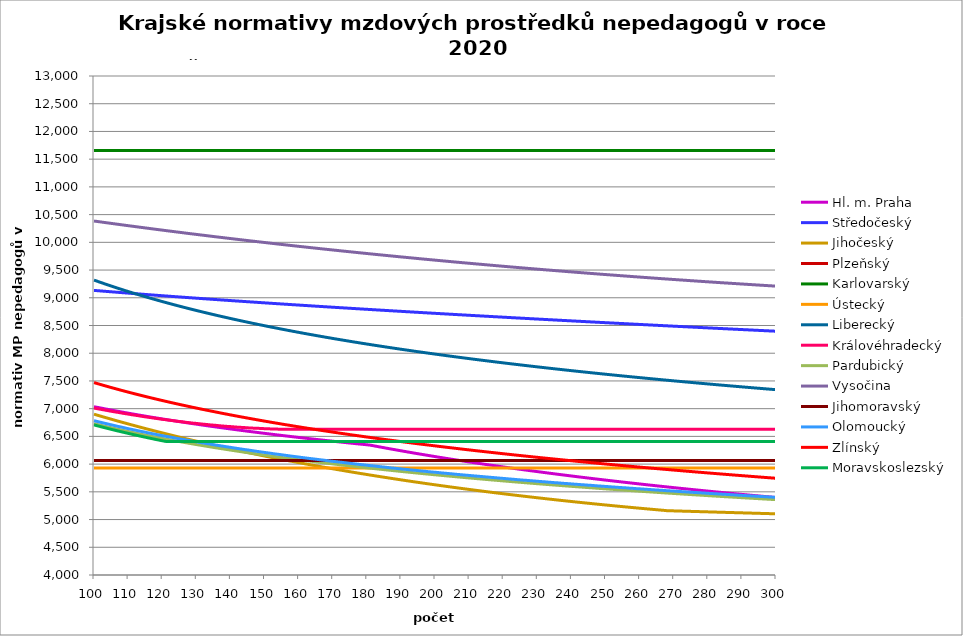
| Category | Hl. m. Praha | Středočeský | Jihočeský | Plzeňský | Karlovarský  | Ústecký   | Liberecký | Královéhradecký | Pardubický | Vysočina | Jihomoravský | Olomoucký | Zlínský | Moravskoslezský |
|---|---|---|---|---|---|---|---|---|---|---|---|---|---|---|
| 100.0 | 7035.713 | 9133.006 | 6900.258 | 3254.201 | 11657.998 | 5928.91 | 9319.242 | 7010.646 | 6730.385 | 10384.094 | 6064.946 | 6782.937 | 7470.451 | 6707.055 |
| 101.0 | 7023.452 | 9127.986 | 6882.106 | 3246.9 | 11657.998 | 5928.91 | 9297.355 | 6999.299 | 6715.356 | 10375.924 | 6064.946 | 6768.131 | 7452.298 | 6690.795 |
| 102.0 | 7011.337 | 9122.995 | 6864.1 | 3239.632 | 11657.998 | 5928.91 | 9275.775 | 6987.988 | 6700.535 | 10367.475 | 6064.946 | 6753.39 | 7434.384 | 6674.772 |
| 103.0 | 6999.366 | 9118.031 | 6846.24 | 3232.397 | 11657.998 | 5928.91 | 9254.495 | 6976.714 | 6685.916 | 10358.75 | 6064.946 | 6738.712 | 7416.705 | 6658.981 |
| 104.0 | 6987.534 | 9113.093 | 6828.523 | 3225.572 | 11657.998 | 5928.91 | 9233.508 | 6965.477 | 6671.494 | 10350.619 | 6064.946 | 6724.099 | 7399.254 | 6643.415 |
| 105.0 | 6975.839 | 9108.183 | 6810.949 | 3218.776 | 11657.998 | 5928.91 | 9212.806 | 6954.275 | 6657.266 | 10342.212 | 6064.946 | 6709.548 | 7382.027 | 6628.071 |
| 106.0 | 6964.277 | 9103.297 | 6793.516 | 3212.008 | 11657.998 | 5928.91 | 9192.382 | 6943.109 | 6643.226 | 10333.818 | 6064.946 | 6695.061 | 7365.018 | 6612.941 |
| 107.0 | 6952.847 | 9098.438 | 6776.222 | 3205.269 | 11657.998 | 5928.91 | 9172.231 | 6933.832 | 6629.371 | 10325.438 | 6064.946 | 6680.636 | 7348.221 | 6598.022 |
| 108.0 | 6941.544 | 9093.603 | 6759.066 | 3198.558 | 11657.998 | 5928.91 | 9152.345 | 6922.732 | 6615.695 | 10317.36 | 6064.946 | 6668.065 | 7331.633 | 6583.307 |
| 109.0 | 6930.367 | 9088.793 | 6742.046 | 3192.245 | 11657.998 | 5928.91 | 9132.719 | 6911.668 | 6602.194 | 10308.719 | 6064.946 | 6653.755 | 7315.248 | 6568.793 |
| 110.0 | 6919.312 | 9084.007 | 6725.162 | 3185.589 | 11657.998 | 5928.91 | 9113.346 | 6902.474 | 6588.866 | 10300.667 | 6064.946 | 6639.507 | 7299.062 | 6554.475 |
| 111.0 | 6908.377 | 9079.245 | 6708.411 | 3179.327 | 11657.998 | 5928.91 | 9094.222 | 6891.474 | 6575.705 | 10292.627 | 6064.946 | 6627.091 | 7283.071 | 6540.347 |
| 112.0 | 6897.56 | 9074.506 | 6691.793 | 3173.09 | 11657.998 | 5928.91 | 9075.339 | 6882.334 | 6562.709 | 10284.6 | 6064.946 | 6614.72 | 7267.269 | 6526.406 |
| 113.0 | 6886.858 | 9069.79 | 6675.306 | 3166.878 | 11657.998 | 5928.91 | 9056.694 | 6873.219 | 6549.873 | 10276.3 | 6064.946 | 6600.639 | 7251.654 | 6512.647 |
| 114.0 | 6876.268 | 9065.096 | 6658.948 | 3160.69 | 11657.998 | 5928.91 | 9038.28 | 6862.312 | 6537.194 | 10268.298 | 6064.946 | 6588.367 | 7236.22 | 6499.067 |
| 115.0 | 6865.789 | 9060.425 | 6642.719 | 3154.526 | 11657.998 | 5928.91 | 9020.093 | 6853.249 | 6524.668 | 10260.309 | 6064.946 | 6576.14 | 7220.965 | 6485.661 |
| 116.0 | 6855.419 | 9055.775 | 6626.617 | 3148.746 | 11657.998 | 5928.91 | 9002.128 | 6844.21 | 6512.293 | 10252.332 | 6064.946 | 6562.222 | 7205.884 | 6472.426 |
| 117.0 | 6845.155 | 9051.147 | 6610.64 | 3142.629 | 11657.998 | 5928.91 | 8984.38 | 6835.195 | 6500.065 | 10244.084 | 6064.946 | 6550.092 | 7190.973 | 6459.358 |
| 118.0 | 6834.994 | 9046.54 | 6594.788 | 3136.893 | 11657.998 | 5928.91 | 8966.844 | 6826.204 | 6487.982 | 10236.132 | 6064.946 | 6538.007 | 7176.23 | 6446.452 |
| 119.0 | 6824.936 | 9041.954 | 6579.06 | 3131.177 | 11657.998 | 5928.91 | 8949.516 | 6817.236 | 6476.039 | 10228.193 | 6064.946 | 6525.967 | 7161.65 | 6433.707 |
| 120.0 | 6814.978 | 9037.388 | 6563.453 | 3125.483 | 11657.998 | 5928.91 | 8932.392 | 6808.292 | 6464.234 | 10220.549 | 6064.946 | 6513.971 | 7147.231 | 6421.118 |
| 121.0 | 6805.118 | 9032.843 | 6547.968 | 3119.809 | 11657.998 | 5928.91 | 8915.467 | 6801.153 | 6452.565 | 10212.352 | 6064.946 | 6502.018 | 7132.969 | 6409.938 |
| 122.0 | 6795.355 | 9028.317 | 6532.602 | 3114.156 | 11657.998 | 5928.91 | 8898.737 | 6792.251 | 6441.028 | 10204.449 | 6064.946 | 6491.808 | 7118.86 | 6409.938 |
| 123.0 | 6785.686 | 9023.811 | 6517.355 | 3108.524 | 11657.998 | 5928.91 | 8882.199 | 6785.146 | 6429.622 | 10196.841 | 6064.946 | 6479.937 | 7104.902 | 6409.938 |
| 124.0 | 6776.109 | 9019.323 | 6502.225 | 3103.261 | 11657.998 | 5928.91 | 8865.848 | 6776.286 | 6418.342 | 10188.962 | 6064.946 | 6468.11 | 7091.093 | 6409.938 |
| 125.0 | 6766.624 | 9014.855 | 6487.211 | 3097.668 | 11657.998 | 5928.91 | 8849.68 | 6769.215 | 6407.188 | 10181.377 | 6064.946 | 6456.325 | 7077.428 | 6409.938 |
| 126.0 | 6757.228 | 9010.406 | 6472.312 | 3092.443 | 11657.998 | 5928.91 | 8833.693 | 6762.158 | 6396.155 | 10173.803 | 6064.946 | 6446.258 | 7063.905 | 6409.938 |
| 127.0 | 6747.92 | 9005.975 | 6457.528 | 3087.235 | 11657.998 | 5928.91 | 8817.883 | 6753.358 | 6385.243 | 10165.68 | 6064.946 | 6434.553 | 7050.522 | 6409.938 |
| 128.0 | 6738.698 | 9001.562 | 6442.856 | 3082.044 | 11657.998 | 5928.91 | 8802.245 | 6746.334 | 6374.448 | 10158.129 | 6064.946 | 6424.553 | 7037.275 | 6409.938 |
| 129.0 | 6729.56 | 8997.167 | 6428.296 | 3076.871 | 11657.998 | 5928.91 | 8786.777 | 6739.325 | 6363.769 | 10150.59 | 6064.946 | 6412.927 | 7024.163 | 6409.938 |
| 130.0 | 6720.506 | 8992.789 | 6413.847 | 3071.716 | 11657.998 | 5928.91 | 8771.476 | 6734.077 | 6353.203 | 10143.061 | 6064.946 | 6402.994 | 7011.182 | 6409.938 |
| 131.0 | 6711.533 | 8988.429 | 6399.508 | 3066.577 | 11657.998 | 5928.91 | 8756.338 | 6727.094 | 6342.748 | 10135.544 | 6064.946 | 6391.446 | 6998.33 | 6409.938 |
| 132.0 | 6702.641 | 8984.086 | 6385.277 | 3061.797 | 11657.998 | 5928.91 | 8741.36 | 6720.124 | 6332.402 | 10128.038 | 6064.946 | 6381.58 | 6985.606 | 6409.938 |
| 133.0 | 6693.827 | 8979.76 | 6371.155 | 3056.692 | 11657.998 | 5928.91 | 8726.539 | 6714.907 | 6322.163 | 10120.543 | 6064.946 | 6371.744 | 6973.005 | 6409.938 |
| 134.0 | 6685.091 | 8975.45 | 6357.138 | 3051.942 | 11657.998 | 5928.91 | 8711.873 | 6707.963 | 6312.029 | 10112.782 | 6064.946 | 6361.939 | 6960.527 | 6409.938 |
| 135.0 | 6676.431 | 8971.157 | 6343.228 | 3046.87 | 11657.998 | 5928.91 | 8697.358 | 6702.764 | 6301.998 | 10105.309 | 6064.946 | 6350.538 | 6948.169 | 6409.938 |
| 136.0 | 6667.846 | 8966.88 | 6329.422 | 3042.151 | 11657.998 | 5928.91 | 8682.991 | 6697.574 | 6292.069 | 10097.848 | 6064.946 | 6340.798 | 6935.928 | 6409.938 |
| 137.0 | 6659.335 | 8962.62 | 6315.719 | 3037.446 | 11657.998 | 5928.91 | 8668.771 | 6690.665 | 6282.238 | 10090.673 | 6064.946 | 6331.087 | 6923.804 | 6409.938 |
| 138.0 | 6650.896 | 8958.374 | 6302.12 | 3032.756 | 11657.998 | 5928.91 | 8654.694 | 6685.493 | 6272.506 | 10083.233 | 6064.946 | 6321.407 | 6911.793 | 6409.938 |
| 139.0 | 6642.528 | 8954.145 | 6288.622 | 3028.081 | 11657.998 | 5928.91 | 8640.758 | 6680.33 | 6262.869 | 10075.804 | 6064.946 | 6311.756 | 6899.894 | 6409.938 |
| 140.0 | 6634.23 | 8949.931 | 6275.226 | 3023.419 | 11657.998 | 5928.91 | 8626.96 | 6676.891 | 6253.327 | 10068.661 | 6064.946 | 6302.134 | 6888.104 | 6409.938 |
| 141.0 | 6626.001 | 8945.731 | 6261.929 | 3018.773 | 11657.998 | 5928.91 | 8613.298 | 6671.741 | 6243.877 | 10061.253 | 6064.946 | 6292.542 | 6876.423 | 6409.938 |
| 142.0 | 6617.84 | 8941.547 | 6248.731 | 3014.471 | 11657.998 | 5928.91 | 8599.77 | 6666.598 | 6234.518 | 10054.131 | 6064.946 | 6282.979 | 6864.847 | 6409.938 |
| 143.0 | 6609.745 | 8937.378 | 6235.631 | 3009.851 | 11657.998 | 5928.91 | 8586.373 | 6663.174 | 6225.248 | 10047.018 | 6064.946 | 6273.445 | 6853.376 | 6409.938 |
| 144.0 | 6601.716 | 8933.223 | 6222.629 | 3005.574 | 11657.998 | 5928.91 | 8573.104 | 6659.754 | 6216.067 | 10039.642 | 6064.946 | 6263.939 | 6842.007 | 6409.938 |
| 145.0 | 6593.752 | 8929.083 | 6209.723 | 3000.982 | 11657.998 | 5928.91 | 8559.962 | 6654.629 | 6206.971 | 10032.55 | 6064.946 | 6256.04 | 6830.739 | 6409.938 |
| 146.0 | 6585.851 | 8924.957 | 6196.913 | 2996.731 | 11657.998 | 5928.91 | 8546.945 | 6651.218 | 6197.961 | 10025.468 | 6064.946 | 6246.588 | 6819.57 | 6409.938 |
| 147.0 | 6578.013 | 8920.844 | 6184.197 | 2992.491 | 11657.998 | 5928.91 | 8534.05 | 6647.809 | 6189.034 | 10018.395 | 6064.946 | 6237.164 | 6808.499 | 6409.938 |
| 148.0 | 6570.236 | 8916.746 | 6171.575 | 2987.939 | 11657.998 | 5928.91 | 8521.276 | 6646.107 | 6180.19 | 10011.333 | 6064.946 | 6227.768 | 6797.523 | 6409.938 |
| 149.0 | 6562.52 | 8912.662 | 6159.047 | 2983.724 | 11657.998 | 5928.91 | 8508.62 | 6642.704 | 6171.426 | 10004.281 | 6064.946 | 6219.96 | 6786.642 | 6409.938 |
| 150.0 | 6554.864 | 8908.591 | 6146.61 | 2979.521 | 11657.998 | 5928.91 | 8496.081 | 6639.304 | 6162.741 | 9997.238 | 6064.946 | 6210.616 | 6775.853 | 6409.938 |
| 151.0 | 6547.267 | 8904.533 | 6134.265 | 2975.33 | 11657.998 | 5928.91 | 8483.656 | 6637.606 | 6154.135 | 9990.206 | 6064.946 | 6202.851 | 6765.156 | 6409.938 |
| 152.0 | 6539.727 | 8900.488 | 6122.01 | 2971.472 | 11657.998 | 5928.91 | 8471.343 | 6634.211 | 6145.606 | 9983.183 | 6064.946 | 6193.558 | 6754.549 | 6409.938 |
| 153.0 | 6532.245 | 8896.457 | 6109.845 | 2967.303 | 11657.998 | 5928.91 | 8459.142 | 6632.515 | 6137.152 | 9976.171 | 6064.946 | 6184.293 | 6744.03 | 6409.938 |
| 154.0 | 6524.818 | 8892.438 | 6097.769 | 2963.147 | 11657.998 | 5928.91 | 8447.05 | 6630.82 | 6128.773 | 9969.168 | 6064.946 | 6176.594 | 6733.598 | 6409.938 |
| 155.0 | 6517.448 | 8888.433 | 6085.782 | 2959.32 | 11657.998 | 5928.91 | 8435.064 | 6629.126 | 6120.468 | 9962.443 | 6064.946 | 6168.913 | 6723.251 | 6409.938 |
| 156.0 | 6510.131 | 8884.44 | 6073.882 | 2955.185 | 11657.998 | 5928.91 | 8423.185 | 6629.126 | 6112.234 | 9955.46 | 6064.946 | 6159.722 | 6712.99 | 6409.938 |
| 157.0 | 6502.869 | 8880.459 | 6062.069 | 2951.379 | 11657.998 | 5928.91 | 8411.41 | 6629.126 | 6104.071 | 9948.486 | 6064.946 | 6152.083 | 6702.811 | 6409.938 |
| 158.0 | 6495.659 | 8876.491 | 6050.341 | 2947.267 | 11657.998 | 5928.91 | 8399.737 | 6629.126 | 6095.979 | 9941.789 | 6064.946 | 6142.942 | 6692.714 | 6409.938 |
| 159.0 | 6488.502 | 8872.534 | 6038.699 | 2943.481 | 11657.998 | 5928.91 | 8388.164 | 6629.126 | 6087.955 | 9935.102 | 6064.946 | 6135.345 | 6682.697 | 6409.938 |
| 160.0 | 6481.396 | 8868.59 | 6027.142 | 2939.705 | 11657.998 | 5928.91 | 8376.691 | 6629.126 | 6079.999 | 9928.157 | 6064.946 | 6127.767 | 6672.76 | 6409.938 |
| 161.0 | 6474.341 | 8864.658 | 6015.668 | 2935.939 | 11657.998 | 5928.91 | 8365.316 | 6629.126 | 6072.11 | 9921.487 | 6064.946 | 6118.698 | 6662.901 | 6409.938 |
| 162.0 | 6467.336 | 8860.738 | 6004.278 | 2932.182 | 11657.998 | 5928.91 | 8354.036 | 6629.126 | 6064.286 | 9915.094 | 6064.946 | 6111.16 | 6653.119 | 6409.938 |
| 163.0 | 6460.381 | 8856.829 | 5992.97 | 2928.123 | 11657.998 | 5928.91 | 8342.852 | 6629.126 | 6056.528 | 9908.176 | 6064.946 | 6103.642 | 6643.413 | 6409.938 |
| 164.0 | 6453.474 | 8852.932 | 5981.744 | 2924.697 | 11657.998 | 5928.91 | 8331.761 | 6629.126 | 6048.833 | 9901.534 | 6064.946 | 6096.142 | 6633.781 | 6409.938 |
| 165.0 | 6446.615 | 8849.046 | 5970.599 | 2920.969 | 11657.998 | 5928.91 | 8320.761 | 6629.126 | 6041.201 | 9894.9 | 6064.946 | 6088.66 | 6624.224 | 6409.938 |
| 166.0 | 6439.803 | 8845.171 | 5959.534 | 2917.25 | 11657.998 | 5928.91 | 8309.852 | 6629.126 | 6033.631 | 9888.276 | 6064.946 | 6081.196 | 6614.738 | 6409.938 |
| 167.0 | 6433.038 | 8841.308 | 5948.549 | 2913.541 | 11657.998 | 5928.91 | 8299.033 | 6629.126 | 6026.122 | 9881.66 | 6064.946 | 6073.751 | 6605.325 | 6409.938 |
| 168.0 | 6426.319 | 8837.456 | 5937.643 | 2909.841 | 11657.998 | 5928.91 | 8288.301 | 6629.126 | 6018.673 | 9875.053 | 6064.946 | 6066.324 | 6595.982 | 6409.938 |
| 169.0 | 6419.645 | 8833.614 | 5926.815 | 2906.458 | 11657.998 | 5928.91 | 8277.656 | 6629.126 | 6011.283 | 9868.456 | 6064.946 | 6057.436 | 6586.708 | 6409.938 |
| 170.0 | 6413.017 | 8829.784 | 5916.066 | 2902.776 | 11657.998 | 5928.91 | 8267.097 | 6629.126 | 6003.952 | 9862.13 | 6064.946 | 6050.049 | 6577.503 | 6409.938 |
| 171.0 | 6406.432 | 8825.964 | 5905.393 | 2899.41 | 11657.998 | 5928.91 | 8256.621 | 6629.126 | 5996.679 | 9855.812 | 6064.946 | 6044.152 | 6568.365 | 6409.938 |
| 172.0 | 6399.891 | 8822.155 | 5894.797 | 2895.746 | 11657.998 | 5928.91 | 8246.229 | 6629.126 | 5989.462 | 9849.24 | 6064.946 | 6036.797 | 6559.294 | 6409.938 |
| 173.0 | 6393.393 | 8818.356 | 5884.277 | 2892.395 | 11657.998 | 5928.91 | 8235.918 | 6629.126 | 5982.302 | 9842.676 | 6064.946 | 6029.46 | 6550.289 | 6409.938 |
| 174.0 | 6386.938 | 8814.567 | 5873.833 | 2889.052 | 11657.998 | 5928.91 | 8225.688 | 6629.126 | 5975.196 | 9836.383 | 6064.946 | 6022.141 | 6541.348 | 6409.938 |
| 175.0 | 6380.525 | 8810.789 | 5863.463 | 2885.414 | 11657.998 | 5928.91 | 8215.537 | 6629.126 | 5968.145 | 9830.099 | 6064.946 | 6014.84 | 6532.472 | 6409.938 |
| 176.0 | 6374.153 | 8807.021 | 5853.167 | 2882.088 | 11657.998 | 5928.91 | 8205.465 | 6629.126 | 5961.148 | 9823.822 | 6064.946 | 6007.556 | 6523.658 | 6409.938 |
| 177.0 | 6367.822 | 8803.264 | 5842.944 | 2878.769 | 11657.998 | 5928.91 | 8195.47 | 6629.126 | 5954.203 | 9817.292 | 6064.946 | 6000.29 | 6514.907 | 6409.938 |
| 178.0 | 6361.531 | 8799.516 | 5832.795 | 2875.457 | 11657.998 | 5928.91 | 8185.552 | 6629.126 | 5947.311 | 9811.032 | 6064.946 | 5993.042 | 6506.217 | 6409.938 |
| 179.0 | 6355.28 | 8795.778 | 5822.718 | 2872.154 | 11657.998 | 5928.91 | 8175.708 | 6629.126 | 5940.471 | 9804.78 | 6064.946 | 5987.256 | 6497.588 | 6409.938 |
| 180.0 | 6349.068 | 8792.049 | 5812.713 | 2868.858 | 11657.998 | 5928.91 | 8165.939 | 6629.126 | 5933.681 | 9798.535 | 6064.946 | 5980.039 | 6489.018 | 6409.938 |
| 181.0 | 6342.353 | 8788.331 | 5802.779 | 2865.569 | 11657.998 | 5928.91 | 8156.242 | 6629.126 | 5926.941 | 9792.299 | 6064.946 | 5972.839 | 6480.507 | 6409.938 |
| 182.0 | 6330.674 | 8784.622 | 5792.916 | 2862.288 | 11657.998 | 5928.91 | 8146.618 | 6629.126 | 5920.251 | 9786.07 | 6064.946 | 5967.092 | 6472.054 | 6409.938 |
| 183.0 | 6319.095 | 8780.923 | 5783.123 | 2859.312 | 11657.998 | 5928.91 | 8137.065 | 6629.126 | 5913.61 | 9779.85 | 6064.946 | 5959.923 | 6463.659 | 6409.938 |
| 184.0 | 6307.613 | 8777.232 | 5773.399 | 2856.045 | 11657.998 | 5928.91 | 8127.583 | 6629.126 | 5907.016 | 9773.896 | 6064.946 | 5952.772 | 6455.32 | 6409.938 |
| 185.0 | 6296.228 | 8773.552 | 5763.745 | 2852.786 | 11657.998 | 5928.91 | 8118.169 | 6629.126 | 5900.471 | 9767.69 | 6064.946 | 5947.063 | 6447.038 | 6409.938 |
| 186.0 | 6284.937 | 8769.88 | 5754.159 | 2849.829 | 11657.998 | 5928.91 | 8108.824 | 6629.126 | 5893.972 | 9761.493 | 6064.946 | 5939.943 | 6438.81 | 6409.938 |
| 187.0 | 6273.74 | 8766.218 | 5744.641 | 2846.584 | 11657.998 | 5928.91 | 8099.547 | 6629.126 | 5887.519 | 9755.561 | 6064.946 | 5932.839 | 6430.637 | 6409.938 |
| 188.0 | 6262.635 | 8762.565 | 5735.191 | 2843.346 | 11657.998 | 5928.91 | 8090.336 | 6629.126 | 5881.113 | 9749.637 | 6064.946 | 5927.168 | 6422.518 | 6409.938 |
| 189.0 | 6251.621 | 8758.921 | 5725.808 | 2840.409 | 11657.998 | 5928.91 | 8081.191 | 6629.126 | 5874.751 | 9743.463 | 6064.946 | 5920.095 | 6414.452 | 6409.938 |
| 190.0 | 6240.696 | 8755.285 | 5716.491 | 2837.478 | 11657.998 | 5928.91 | 8072.111 | 6629.126 | 5868.434 | 9737.296 | 6064.946 | 5914.449 | 6406.438 | 6409.938 |
| 191.0 | 6229.86 | 8751.659 | 5707.24 | 2834.261 | 11657.998 | 5928.91 | 8063.095 | 6629.126 | 5862.161 | 9731.65 | 6064.946 | 5907.407 | 6398.476 | 6409.938 |
| 192.0 | 6219.11 | 8748.041 | 5698.055 | 2831.343 | 11657.998 | 5928.91 | 8054.142 | 6629.126 | 5855.931 | 9725.498 | 6064.946 | 5901.784 | 6390.566 | 6409.938 |
| 193.0 | 6208.446 | 8744.432 | 5688.935 | 2828.43 | 11657.998 | 5928.91 | 8045.252 | 6629.126 | 5849.744 | 9719.866 | 6064.946 | 5894.772 | 6382.706 | 6409.938 |
| 194.0 | 6197.867 | 8740.832 | 5679.879 | 2825.234 | 11657.998 | 5928.91 | 8036.423 | 6629.126 | 5843.6 | 9713.73 | 6064.946 | 5889.174 | 6374.895 | 6409.938 |
| 195.0 | 6187.371 | 8737.24 | 5670.887 | 2822.334 | 11657.998 | 5928.91 | 8027.656 | 6629.126 | 5837.497 | 9707.856 | 6064.946 | 5883.586 | 6367.135 | 6409.938 |
| 196.0 | 6176.957 | 8733.656 | 5661.959 | 2819.44 | 11657.998 | 5928.91 | 8018.948 | 6629.126 | 5831.436 | 9701.734 | 6064.946 | 5876.617 | 6359.422 | 6409.938 |
| 197.0 | 6166.624 | 8730.081 | 5653.094 | 2816.552 | 11657.998 | 5928.91 | 8010.3 | 6629.126 | 5825.416 | 9696.129 | 6064.946 | 5871.053 | 6351.758 | 6409.938 |
| 198.0 | 6156.372 | 8726.514 | 5644.292 | 2813.67 | 11657.998 | 5928.91 | 8001.711 | 6629.126 | 5819.435 | 9690.277 | 6064.946 | 5864.113 | 6344.142 | 6409.938 |
| 199.0 | 6146.198 | 8722.956 | 5635.552 | 2810.794 | 11657.998 | 5928.91 | 7993.179 | 6629.126 | 5813.495 | 9684.685 | 6064.946 | 5858.573 | 6336.572 | 6409.938 |
| 200.0 | 6136.102 | 8719.405 | 5626.873 | 2807.924 | 11657.998 | 5928.91 | 7984.705 | 6629.126 | 5807.594 | 9678.847 | 6064.946 | 5853.044 | 6329.049 | 6409.938 |
| 201.0 | 6126.084 | 8715.863 | 5618.256 | 2805.06 | 11657.998 | 5928.91 | 7976.287 | 6629.126 | 5801.732 | 9673.015 | 6064.946 | 5847.525 | 6321.572 | 6409.938 |
| 202.0 | 6116.14 | 8712.329 | 5609.7 | 2802.201 | 11657.998 | 5928.91 | 7967.925 | 6629.126 | 5795.908 | 9667.443 | 6064.946 | 5840.64 | 6314.14 | 6409.938 |
| 203.0 | 6106.272 | 8708.802 | 5601.204 | 2799.348 | 11657.998 | 5928.91 | 7959.619 | 6629.126 | 5790.122 | 9661.625 | 6064.946 | 5835.145 | 6306.753 | 6409.938 |
| 204.0 | 6096.478 | 8705.284 | 5592.769 | 2796.786 | 11657.998 | 5928.91 | 7951.366 | 6629.126 | 5784.373 | 9656.067 | 6064.946 | 5829.659 | 6299.41 | 6409.938 |
| 205.0 | 6086.756 | 8701.773 | 5584.392 | 2793.944 | 11657.998 | 5928.91 | 7943.168 | 6629.126 | 5778.662 | 9650.263 | 6064.946 | 5824.184 | 6292.11 | 6409.938 |
| 206.0 | 6077.106 | 8698.27 | 5576.075 | 2791.108 | 11657.998 | 5928.91 | 7935.023 | 6629.126 | 5772.987 | 9644.465 | 6064.946 | 5817.355 | 6284.855 | 6409.938 |
| 207.0 | 6067.527 | 8694.775 | 5567.817 | 2788.561 | 11657.998 | 5928.91 | 7926.931 | 6629.126 | 5767.348 | 9639.178 | 6064.946 | 5811.903 | 6277.641 | 6409.938 |
| 208.0 | 6058.019 | 8691.288 | 5559.617 | 2785.736 | 11657.998 | 5928.91 | 7918.89 | 6629.126 | 5761.745 | 9633.394 | 6064.946 | 5806.461 | 6270.471 | 6409.938 |
| 209.0 | 6048.579 | 8687.808 | 5551.475 | 2783.198 | 11657.998 | 5928.91 | 7910.902 | 6629.126 | 5756.178 | 9628.119 | 6064.946 | 5801.029 | 6263.342 | 6409.938 |
| 210.0 | 6039.208 | 8684.335 | 5543.39 | 2780.384 | 11657.998 | 5928.91 | 7902.963 | 6629.126 | 5750.645 | 9622.348 | 6064.946 | 5795.607 | 6256.254 | 6409.938 |
| 211.0 | 6029.904 | 8680.87 | 5535.363 | 2777.856 | 11657.998 | 5928.91 | 7895.075 | 6629.126 | 5745.147 | 9617.086 | 6064.946 | 5790.196 | 6249.207 | 6409.938 |
| 212.0 | 6020.667 | 8677.413 | 5527.392 | 2775.053 | 11657.998 | 5928.91 | 7887.237 | 6629.126 | 5739.683 | 9611.328 | 6064.946 | 5784.795 | 6242.2 | 6409.938 |
| 213.0 | 6011.495 | 8673.962 | 5519.478 | 2772.535 | 11657.998 | 5928.91 | 7879.448 | 6629.126 | 5734.253 | 9606.077 | 6064.946 | 5779.404 | 6235.234 | 6409.938 |
| 214.0 | 6002.388 | 8670.519 | 5511.619 | 2769.742 | 11657.998 | 5928.91 | 7871.707 | 6629.126 | 5728.856 | 9600.582 | 6064.946 | 5774.022 | 6228.307 | 6409.938 |
| 215.0 | 5993.346 | 8667.084 | 5503.817 | 2767.234 | 11657.998 | 5928.91 | 7864.014 | 6629.126 | 5723.492 | 9595.094 | 6064.946 | 5768.651 | 6221.419 | 6409.938 |
| 216.0 | 5984.366 | 8663.655 | 5496.069 | 2764.73 | 11657.998 | 5928.91 | 7856.369 | 6629.126 | 5718.161 | 9589.612 | 6064.946 | 5763.29 | 6214.57 | 6409.938 |
| 217.0 | 5975.45 | 8660.234 | 5488.376 | 2762.23 | 11657.998 | 5928.91 | 7848.771 | 6629.126 | 5712.862 | 9584.385 | 6064.946 | 5757.939 | 6207.759 | 6409.938 |
| 218.0 | 5966.595 | 8656.819 | 5480.738 | 2759.458 | 11657.998 | 5928.91 | 7841.219 | 6629.126 | 5707.595 | 9578.915 | 6064.946 | 5752.597 | 6200.985 | 6409.938 |
| 219.0 | 5957.801 | 8653.412 | 5473.153 | 2756.968 | 11657.998 | 5928.91 | 7833.712 | 6629.126 | 5702.36 | 9573.699 | 6064.946 | 5747.266 | 6194.25 | 6409.938 |
| 220.0 | 5949.067 | 8650.011 | 5465.623 | 2754.483 | 11657.998 | 5928.91 | 7826.251 | 6629.126 | 5697.156 | 9568.241 | 6064.946 | 5741.944 | 6187.551 | 6409.938 |
| 221.0 | 5940.393 | 8646.618 | 5458.146 | 2752.002 | 11657.998 | 5928.91 | 7818.835 | 6629.126 | 5691.982 | 9563.037 | 6064.946 | 5736.633 | 6180.889 | 6409.938 |
| 222.0 | 5931.777 | 8643.231 | 5450.721 | 2749.525 | 11657.998 | 5928.91 | 7811.464 | 6629.126 | 5686.839 | 9557.592 | 6064.946 | 5731.331 | 6174.263 | 6409.938 |
| 223.0 | 5923.22 | 8639.851 | 5443.35 | 2747.053 | 11657.998 | 5928.91 | 7804.136 | 6629.126 | 5681.727 | 9552.647 | 6064.946 | 5726.039 | 6167.673 | 6409.938 |
| 224.0 | 5914.72 | 8636.478 | 5436.031 | 2744.585 | 11657.998 | 5928.91 | 7796.852 | 6629.126 | 5676.644 | 9547.46 | 6064.946 | 5720.756 | 6161.118 | 6409.938 |
| 225.0 | 5906.277 | 8633.112 | 5428.763 | 2742.122 | 11657.998 | 5928.91 | 7789.61 | 6629.126 | 5671.591 | 9542.032 | 6064.946 | 5715.484 | 6154.598 | 6409.938 |
| 226.0 | 5897.89 | 8629.752 | 5421.548 | 2739.663 | 11657.998 | 5928.91 | 7782.411 | 6629.126 | 5666.567 | 9537.103 | 6064.946 | 5710.221 | 6148.113 | 6409.938 |
| 227.0 | 5889.559 | 8626.399 | 5414.383 | 2737.209 | 11657.998 | 5928.91 | 7775.254 | 6629.126 | 5661.572 | 9531.686 | 6064.946 | 5706.28 | 6141.663 | 6409.938 |
| 228.0 | 5881.282 | 8623.052 | 5407.27 | 2735.031 | 11657.998 | 5928.91 | 7768.139 | 6629.126 | 5656.606 | 9526.768 | 6064.946 | 5701.034 | 6135.246 | 6409.938 |
| 229.0 | 5873.059 | 8619.712 | 5400.207 | 2732.585 | 11657.998 | 5928.91 | 7761.065 | 6629.126 | 5651.668 | 9521.609 | 6064.946 | 5695.798 | 6128.864 | 6409.938 |
| 230.0 | 5864.89 | 8616.379 | 5393.195 | 2730.143 | 11657.998 | 5928.91 | 7754.031 | 6629.126 | 5646.758 | 9516.456 | 6064.946 | 5690.571 | 6122.514 | 6409.938 |
| 231.0 | 5856.774 | 8613.052 | 5386.233 | 2727.706 | 11657.998 | 5928.91 | 7747.038 | 6629.126 | 5641.876 | 9511.553 | 6064.946 | 5685.354 | 6116.198 | 6409.938 |
| 232.0 | 5848.71 | 8609.731 | 5379.32 | 2725.543 | 11657.998 | 5928.91 | 7740.084 | 6629.126 | 5637.021 | 9506.166 | 6064.946 | 5681.448 | 6109.914 | 6409.938 |
| 233.0 | 5840.698 | 8606.416 | 5372.457 | 2723.113 | 11657.998 | 5928.91 | 7733.17 | 6629.126 | 5632.193 | 9501.274 | 6064.946 | 5676.247 | 6103.662 | 6409.938 |
| 234.0 | 5832.737 | 8603.108 | 5365.643 | 2720.689 | 11657.998 | 5928.91 | 7726.296 | 6629.126 | 5627.393 | 9496.387 | 6064.946 | 5671.056 | 6097.442 | 6409.938 |
| 235.0 | 5824.827 | 8599.806 | 5358.877 | 2718.537 | 11657.998 | 5928.91 | 7719.459 | 6629.126 | 5622.619 | 9491.261 | 6064.946 | 5665.875 | 6091.255 | 6409.938 |
| 236.0 | 5816.966 | 8596.51 | 5352.16 | 2716.12 | 11657.998 | 5928.91 | 7712.661 | 6629.126 | 5617.871 | 9486.384 | 6064.946 | 5661.995 | 6085.098 | 6409.938 |
| 237.0 | 5809.155 | 8593.221 | 5345.492 | 2713.976 | 11657.998 | 5928.91 | 7705.901 | 6629.126 | 5613.149 | 9481.512 | 6064.946 | 5656.83 | 6078.972 | 6409.938 |
| 238.0 | 5801.393 | 8589.937 | 5338.871 | 2711.567 | 11657.998 | 5928.91 | 7699.178 | 6629.126 | 5608.453 | 9476.402 | 6064.946 | 5651.675 | 6072.878 | 6409.938 |
| 239.0 | 5793.679 | 8586.66 | 5332.297 | 2709.43 | 11657.998 | 5928.91 | 7692.492 | 6629.126 | 5603.783 | 9471.54 | 6064.946 | 5647.814 | 6066.813 | 6409.938 |
| 240.0 | 5786.013 | 8583.388 | 5325.771 | 2707.029 | 11657.998 | 5928.91 | 7685.843 | 6629.126 | 5599.138 | 9466.926 | 6064.946 | 5642.675 | 6060.779 | 6409.938 |
| 241.0 | 5778.394 | 8580.123 | 5319.292 | 2704.899 | 11657.998 | 5928.91 | 7679.23 | 6629.126 | 5594.518 | 9461.832 | 6064.946 | 5637.545 | 6054.775 | 6409.938 |
| 242.0 | 5770.822 | 8576.864 | 5312.859 | 2702.772 | 11657.998 | 5928.91 | 7672.654 | 6629.126 | 5589.923 | 9456.986 | 6064.946 | 5633.704 | 6048.8 | 6409.938 |
| 243.0 | 5763.296 | 8573.61 | 5306.473 | 2700.383 | 11657.998 | 5928.91 | 7666.112 | 6629.126 | 5585.353 | 9452.386 | 6064.946 | 5628.591 | 6042.854 | 6409.938 |
| 244.0 | 5755.816 | 8570.362 | 5300.134 | 2698.263 | 11657.998 | 5928.91 | 7659.607 | 6629.126 | 5580.807 | 9447.549 | 6064.946 | 5624.762 | 6036.938 | 6409.938 |
| 245.0 | 5748.381 | 8567.121 | 5293.84 | 2696.147 | 11657.998 | 5928.91 | 7653.136 | 6629.126 | 5576.284 | 9442.717 | 6064.946 | 5619.665 | 6031.05 | 6409.938 |
| 246.0 | 5740.991 | 8563.885 | 5287.591 | 2694.034 | 11657.998 | 5928.91 | 7646.699 | 6629.126 | 5571.786 | 9437.89 | 6064.946 | 5615.848 | 6025.19 | 6409.938 |
| 247.0 | 5733.645 | 8560.654 | 5281.388 | 2691.66 | 11657.998 | 5928.91 | 7640.297 | 6629.126 | 5567.311 | 9433.309 | 6064.946 | 5610.767 | 6019.359 | 6409.938 |
| 248.0 | 5726.343 | 8557.43 | 5275.23 | 2689.554 | 11657.998 | 5928.91 | 7633.929 | 6629.126 | 5562.86 | 9428.25 | 6064.946 | 5605.695 | 6013.556 | 6409.938 |
| 249.0 | 5719.085 | 8554.211 | 5269.117 | 2687.451 | 11657.998 | 5928.91 | 7627.594 | 6629.126 | 5558.432 | 9423.679 | 6064.946 | 5601.897 | 6007.78 | 6409.938 |
| 250.0 | 5711.869 | 8550.998 | 5263.048 | 2685.352 | 11657.998 | 5928.91 | 7621.292 | 6629.126 | 5554.027 | 9419.111 | 6064.946 | 5596.841 | 6002.032 | 6409.938 |
| 251.0 | 5704.696 | 8547.79 | 5257.024 | 2683.255 | 11657.998 | 5928.91 | 7615.024 | 6629.126 | 5549.644 | 9414.548 | 6064.946 | 5593.055 | 5996.31 | 6409.938 |
| 252.0 | 5697.564 | 8544.588 | 5251.043 | 2681.162 | 11657.998 | 5928.91 | 7608.788 | 6629.126 | 5545.284 | 9409.99 | 6064.946 | 5588.015 | 5990.616 | 6409.938 |
| 253.0 | 5690.475 | 8541.392 | 5245.107 | 2679.072 | 11657.998 | 5928.91 | 7602.584 | 6629.126 | 5540.947 | 9405.196 | 6064.946 | 5584.241 | 5984.948 | 6409.938 |
| 254.0 | 5683.426 | 8538.201 | 5239.214 | 2676.986 | 11657.998 | 5928.91 | 7596.412 | 6629.126 | 5536.631 | 9400.647 | 6064.946 | 5579.217 | 5979.307 | 6409.938 |
| 255.0 | 5676.418 | 8535.015 | 5233.364 | 2674.903 | 11657.998 | 5928.91 | 7590.272 | 6629.126 | 5532.337 | 9396.102 | 6064.946 | 5575.455 | 5973.692 | 6409.938 |
| 256.0 | 5669.451 | 8531.835 | 5227.557 | 2672.823 | 11657.998 | 5928.91 | 7584.164 | 6629.126 | 5528.065 | 9391.561 | 6064.946 | 5571.698 | 5968.103 | 6409.938 |
| 257.0 | 5662.523 | 8528.661 | 5221.793 | 2670.746 | 11657.998 | 5928.91 | 7578.086 | 6629.126 | 5523.815 | 9387.025 | 6064.946 | 5566.697 | 5962.539 | 6409.938 |
| 258.0 | 5655.635 | 8525.492 | 5216.071 | 2668.672 | 11657.998 | 5928.91 | 7572.04 | 6629.126 | 5519.586 | 9382.254 | 6064.946 | 5562.951 | 5957.001 | 6409.938 |
| 259.0 | 5648.786 | 8522.328 | 5210.392 | 2666.602 | 11657.998 | 5928.91 | 7566.023 | 6629.126 | 5515.377 | 9377.965 | 6064.946 | 5557.965 | 5951.488 | 6409.938 |
| 260.0 | 5641.975 | 8519.169 | 5204.755 | 2664.535 | 11657.998 | 5928.91 | 7560.037 | 6629.126 | 5511.19 | 9373.442 | 6064.946 | 5554.232 | 5946 | 6409.938 |
| 261.0 | 5635.203 | 8516.016 | 5199.16 | 2662.471 | 11657.998 | 5928.91 | 7554.081 | 6629.126 | 5507.023 | 9368.923 | 6064.946 | 5550.503 | 5940.536 | 6409.938 |
| 262.0 | 5628.469 | 8512.868 | 5193.606 | 2660.668 | 11657.998 | 5928.91 | 7548.155 | 6629.126 | 5502.877 | 9364.646 | 6064.946 | 5545.54 | 5935.098 | 6409.938 |
| 263.0 | 5621.772 | 8509.725 | 5188.094 | 2658.61 | 11657.998 | 5928.91 | 7542.258 | 6629.126 | 5498.751 | 9360.136 | 6064.946 | 5541.823 | 5929.683 | 6409.938 |
| 264.0 | 5615.113 | 8506.587 | 5182.622 | 2656.555 | 11657.998 | 5928.91 | 7536.39 | 6629.126 | 5494.645 | 9355.63 | 6064.946 | 5536.875 | 5924.293 | 6409.938 |
| 265.0 | 5608.49 | 8503.455 | 5177.192 | 2654.76 | 11657.998 | 5928.91 | 7530.551 | 6629.126 | 5490.56 | 9351.365 | 6064.946 | 5533.17 | 5918.926 | 6409.938 |
| 266.0 | 5601.903 | 8500.328 | 5171.802 | 2652.711 | 11657.998 | 5928.91 | 7524.741 | 6629.126 | 5486.494 | 9346.867 | 6064.946 | 5529.469 | 5913.584 | 6409.938 |
| 267.0 | 5595.353 | 8497.205 | 5166.453 | 2650.665 | 11657.998 | 5928.91 | 7518.959 | 6629.126 | 5482.447 | 9342.611 | 6064.946 | 5525.774 | 5908.264 | 6409.938 |
| 268.0 | 5588.839 | 8494.088 | 5160.173 | 2648.878 | 11657.998 | 5928.91 | 7513.205 | 6629.126 | 5478.42 | 9338.358 | 6064.946 | 5520.855 | 5902.968 | 6409.938 |
| 269.0 | 5582.359 | 8490.976 | 5158.369 | 2646.838 | 11657.998 | 5928.91 | 7507.479 | 6629.126 | 5474.412 | 9334.109 | 6064.946 | 5517.171 | 5897.695 | 6409.938 |
| 270.0 | 5575.915 | 8487.869 | 5156.568 | 2644.801 | 11657.998 | 5928.91 | 7501.78 | 6629.126 | 5470.423 | 9329.863 | 6064.946 | 5513.492 | 5892.445 | 6409.938 |
| 271.0 | 5569.506 | 8484.767 | 5154.768 | 2643.022 | 11657.998 | 5928.91 | 7496.109 | 6629.126 | 5466.454 | 9325.622 | 6064.946 | 5508.594 | 5887.218 | 6409.938 |
| 272.0 | 5563.131 | 8481.669 | 5152.971 | 2640.991 | 11657.998 | 5928.91 | 7490.465 | 6629.126 | 5462.503 | 9321.384 | 6064.946 | 5504.927 | 5882.013 | 6409.938 |
| 273.0 | 5556.79 | 8478.577 | 5151.176 | 2639.217 | 11657.998 | 5928.91 | 7484.848 | 6629.126 | 5458.57 | 9317.151 | 6064.946 | 5501.264 | 5876.83 | 6409.938 |
| 274.0 | 5550.482 | 8475.49 | 5149.383 | 2637.192 | 11657.998 | 5928.91 | 7479.257 | 6629.126 | 5454.656 | 9312.921 | 6064.946 | 5497.606 | 5871.67 | 6409.938 |
| 275.0 | 5544.208 | 8472.407 | 5147.592 | 2635.423 | 11657.998 | 5928.91 | 7473.693 | 6629.126 | 5450.76 | 9308.46 | 6064.946 | 5492.737 | 5866.531 | 6409.938 |
| 276.0 | 5537.967 | 8469.33 | 5145.804 | 2633.404 | 11657.998 | 5928.91 | 7468.155 | 6629.126 | 5446.882 | 9304.707 | 6064.946 | 5489.091 | 5861.414 | 6409.938 |
| 277.0 | 5531.759 | 8466.257 | 5144.018 | 2631.639 | 11657.998 | 5928.91 | 7462.643 | 6629.126 | 5443.022 | 9300.254 | 6064.946 | 5485.449 | 5856.319 | 6409.938 |
| 278.0 | 5525.583 | 8463.189 | 5142.234 | 2629.878 | 11657.998 | 5928.91 | 7457.157 | 6629.126 | 5439.18 | 9296.274 | 6064.946 | 5481.812 | 5851.245 | 6409.938 |
| 279.0 | 5519.44 | 8460.125 | 5140.452 | 2627.867 | 11657.998 | 5928.91 | 7451.696 | 6629.126 | 5435.356 | 9292.063 | 6064.946 | 5478.18 | 5846.192 | 6409.938 |
| 280.0 | 5513.328 | 8457.067 | 5138.672 | 2626.11 | 11657.998 | 5928.91 | 7446.261 | 6629.126 | 5431.549 | 9288.09 | 6064.946 | 5473.345 | 5841.161 | 6409.938 |
| 281.0 | 5507.248 | 8454.013 | 5136.894 | 2624.356 | 11657.998 | 5928.91 | 7440.85 | 6629.126 | 5427.76 | 9283.886 | 6064.946 | 5469.724 | 5836.15 | 6409.938 |
| 282.0 | 5501.199 | 8450.964 | 5135.119 | 2622.354 | 11657.998 | 5928.91 | 7435.465 | 6629.126 | 5423.987 | 9279.92 | 6064.946 | 5466.108 | 5831.159 | 6409.938 |
| 283.0 | 5495.181 | 8447.919 | 5133.345 | 2620.604 | 11657.998 | 5928.91 | 7430.104 | 6629.126 | 5420.232 | 9275.723 | 6064.946 | 5462.497 | 5826.19 | 6409.938 |
| 284.0 | 5489.193 | 8444.879 | 5131.574 | 2618.857 | 11657.998 | 5928.91 | 7424.767 | 6629.126 | 5416.493 | 9271.764 | 6064.946 | 5458.891 | 5821.24 | 6409.938 |
| 285.0 | 5483.236 | 8441.844 | 5129.805 | 2617.112 | 11657.998 | 5928.91 | 7419.455 | 6629.126 | 5412.772 | 9267.808 | 6064.946 | 5455.289 | 5816.311 | 6409.938 |
| 286.0 | 5477.31 | 8438.813 | 5128.038 | 2615.121 | 11657.998 | 5928.91 | 7414.167 | 6629.126 | 5409.066 | 9264.088 | 6064.946 | 5451.692 | 5811.402 | 6409.938 |
| 287.0 | 5471.413 | 8435.787 | 5126.273 | 2613.381 | 11657.998 | 5928.91 | 7408.902 | 6629.126 | 5405.378 | 9260.138 | 6064.946 | 5448.1 | 5806.512 | 6409.938 |
| 288.0 | 5465.545 | 8432.765 | 5124.511 | 2611.644 | 11657.998 | 5928.91 | 7403.661 | 6629.126 | 5401.706 | 9256.192 | 6064.946 | 5443.318 | 5801.642 | 6409.938 |
| 289.0 | 5459.707 | 8429.748 | 5122.75 | 2609.909 | 11657.998 | 5928.91 | 7398.444 | 6629.126 | 5398.05 | 9252.249 | 6064.946 | 5439.737 | 5796.792 | 6409.938 |
| 290.0 | 5453.898 | 8426.735 | 5120.992 | 2608.176 | 11657.998 | 5928.91 | 7393.25 | 6629.126 | 5394.41 | 9248.309 | 6064.946 | 5436.16 | 5791.961 | 6409.938 |
| 291.0 | 5448.118 | 8423.727 | 5119.236 | 2606.445 | 11657.998 | 5928.91 | 7388.079 | 6629.126 | 5390.786 | 9244.373 | 6064.946 | 5432.589 | 5787.15 | 6409.938 |
| 292.0 | 5442.366 | 8420.724 | 5117.482 | 2604.717 | 11657.998 | 5928.91 | 7382.93 | 6629.126 | 5387.177 | 9240.44 | 6064.946 | 5429.022 | 5782.357 | 6409.938 |
| 293.0 | 5436.643 | 8417.724 | 5115.73 | 2602.991 | 11657.998 | 5928.91 | 7377.805 | 6629.126 | 5383.585 | 9236.742 | 6064.946 | 5425.459 | 5777.583 | 6409.938 |
| 294.0 | 5430.948 | 8414.729 | 5113.98 | 2601.268 | 11657.998 | 5928.91 | 7372.701 | 6629.126 | 5380.008 | 9232.816 | 6064.946 | 5421.902 | 5772.828 | 6409.938 |
| 295.0 | 5425.28 | 8411.739 | 5112.232 | 2599.546 | 11657.998 | 5928.91 | 7367.621 | 6629.126 | 5376.446 | 9228.893 | 6064.946 | 5418.349 | 5768.092 | 6409.938 |
| 296.0 | 5419.64 | 8408.753 | 5110.487 | 2597.827 | 11657.998 | 5928.91 | 7362.562 | 6629.126 | 5372.9 | 9225.204 | 6064.946 | 5414.8 | 5763.374 | 6409.938 |
| 297.0 | 5414.027 | 8405.771 | 5108.743 | 2596.11 | 11657.998 | 5928.91 | 7357.525 | 6629.126 | 5369.369 | 9221.287 | 6064.946 | 5411.257 | 5758.675 | 6409.938 |
| 298.0 | 5408.442 | 8402.793 | 5107.002 | 2594.396 | 11657.998 | 5928.91 | 7352.51 | 6629.126 | 5365.853 | 9217.604 | 6064.946 | 5407.717 | 5753.994 | 6409.938 |
| 299.0 | 5402.883 | 8399.82 | 5105.262 | 2592.683 | 11657.998 | 5928.91 | 7347.517 | 6629.126 | 5362.352 | 9213.924 | 6064.946 | 5404.183 | 5749.33 | 6409.938 |
| 300.0 | 5397.35 | 8396.851 | 5103.525 | 2590.973 | 11657.998 | 5928.91 | 7342.544 | 6629.126 | 5358.866 | 9210.247 | 6064.946 | 5400.653 | 5744.685 | 6409.938 |